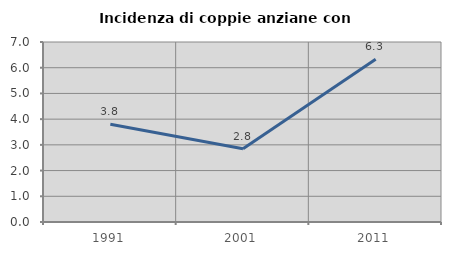
| Category | Incidenza di coppie anziane con figli |
|---|---|
| 1991.0 | 3.803 |
| 2001.0 | 2.846 |
| 2011.0 | 6.327 |